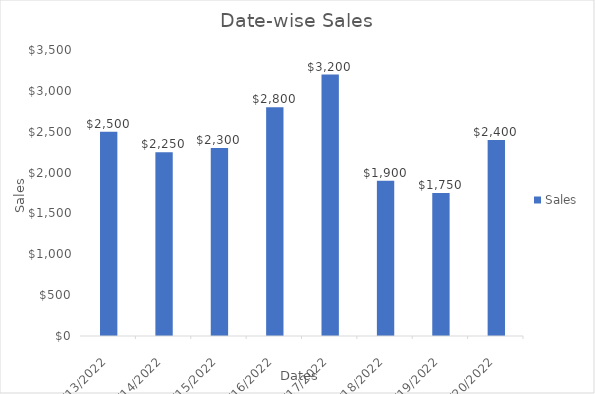
| Category | Sales |
|---|---|
| 11/13/22 | 2500 |
| 11/14/22 | 2250 |
| 11/15/22 | 2300 |
| 11/16/22 | 2800 |
| 11/17/22 | 3200 |
| 11/18/22 | 1900 |
| 11/19/22 | 1750 |
| 11/20/22 | 2400 |